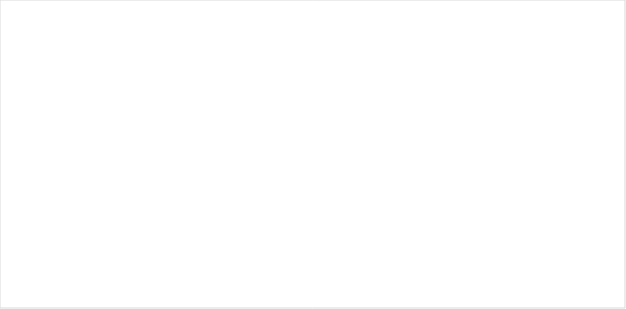
| Category | Total |
|---|---|
| N.C | 1 |
| = | 8 |
| + | 3 |